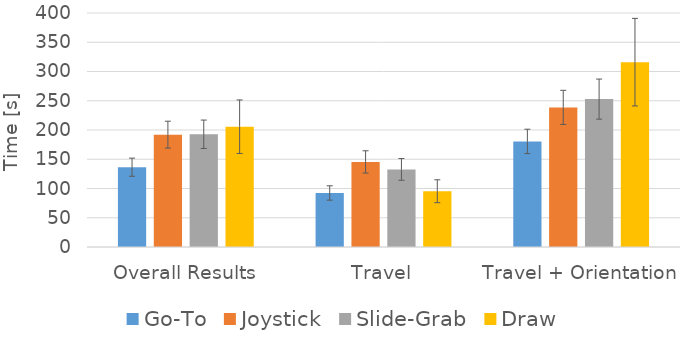
| Category | Go-To | Joystick | Slide-Grab | Draw |
|---|---|---|---|---|
| Overall Results | 136.426 | 192.053 | 192.712 | 205.637 |
| Travel | 92.33 | 145.455 | 132.642 | 95.329 |
| Travel + Orientation | 180.522 | 238.651 | 252.782 | 315.945 |